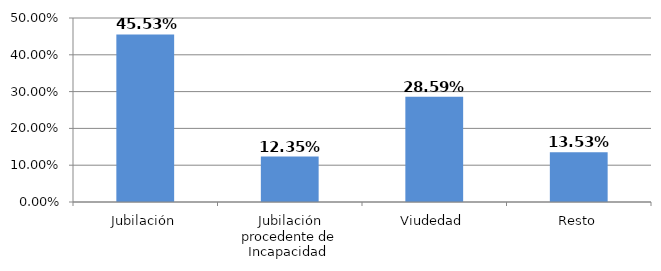
| Category | Series 0 |
|---|---|
| Jubilación | 0.455 |
| Jubilación procedente de Incapacidad  | 0.124 |
| Viudedad | 0.286 |
| Resto | 0.135 |